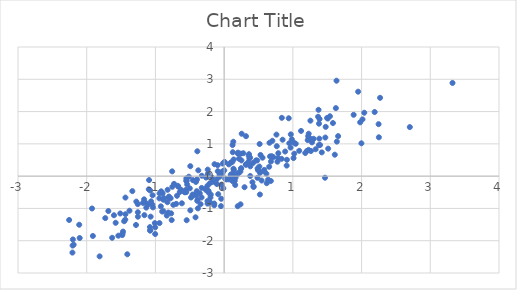
| Category | Series 0 |
|---|---|
| 0.160946651876732 | -0.274 |
| -0.615124180067025 | -0.841 |
| -0.238992660518427 | 0.202 |
| 0.614980688566654 | 0.075 |
| -0.901399740475513 | -1.096 |
| 0.348077717998722 | 0.426 |
| 0.947959158309703 | 1.018 |
| -1.72987447164957 | -1.3 |
| 0.0971250760577167 | 0.05 |
| 1.37857743076593 | 0.961 |
| -0.916733728524122 | -0.47 |
| -1.035666336437 | -0.968 |
| -0.224145165452657 | -0.513 |
| 2.70219252104673 | 1.52 |
| 0.520233681443548 | -0.569 |
| -0.459716828268949 | -0.57 |
| 0.765993572091399 | 0.927 |
| -0.802699944823501 | -0.633 |
| -0.262195468911025 | -0.371 |
| 1.58348036764361 | 1.645 |
| 1.65870819725486 | 1.239 |
| -0.390094702698103 | 0.77 |
| -1.07746904537421 | -1.686 |
| -0.242535334187792 | -0.772 |
| -1.57870613654062 | -1.445 |
| -0.894718571122171 | -0.531 |
| 0.516387038247074 | 0.995 |
| -1.62979103842948 | -1.91 |
| 0.296839254848134 | -0.343 |
| 0.278366491918356 | 0.71 |
| -1.13284176934728 | -0.975 |
| -0.324500552176947 | 0.012 |
| -1.33606163125554 | -0.464 |
| 0.380607522894947 | 0.303 |
| 2.0134998490355 | 1.759 |
| -1.43600033947788 | -1.179 |
| 1.04205325234069 | 1.003 |
| 0.244543674262494 | 0.227 |
| 1.38559620247189 | 1.161 |
| 0.248287439296835 | 0.247 |
| 0.133289291835339 | 1.064 |
| -2.25582289472346 | -1.358 |
| -0.398868811937196 | -0.466 |
| 0.199769403632539 | 0.698 |
| 1.22291797992834 | 1.235 |
| -0.342927631277945 | -0.869 |
| -0.143765697169237 | -0.849 |
| 0.412032153731006 | -0.189 |
| 1.2289241542928 | 0.813 |
| 1.42092287875088 | 0.737 |
| -0.0943369723016265 | 0.338 |
| 0.154736995946148 | -0.14 |
| -0.729374576435108 | -0.239 |
| -0.685610712656531 | -0.609 |
| -1.40929884094785 | -2.42 |
| -0.939915624690563 | -0.534 |
| -1.60339226401106 | -1.211 |
| 0.00958780984204322 | 0.435 |
| -0.410777708551837 | -0.18 |
| 0.12003371847159 | 0.444 |
| 0.31656943258921 | 0.356 |
| -0.739846252762422 | -0.888 |
| 1.3736298282967 | 2.054 |
| 1.26277412193541 | 0.779 |
| 0.659726460285925 | 1.033 |
| -0.193893966526571 | -0.571 |
| -0.554283939642186 | -0.421 |
| -1.25595506815388 | -1.118 |
| -0.884081299107951 | -0.73 |
| -1.16478087259423 | -0.719 |
| -1.0696558947721 | -1.255 |
| 0.575700237428579 | 0.159 |
| 2.24777841377026 | 1.61 |
| 0.238687291933 | -0.873 |
| 0.761270682578169 | 1.286 |
| -0.35464424898648 | -0.531 |
| -2.2077409492235 | -2.368 |
| -0.037189918367408 | -0.262 |
| 0.0328181724199283 | -0.103 |
| -1.18071868225266 | -0.828 |
| 0.176503539493442 | 0.029 |
| 1.47801327160652 | 1.527 |
| -0.226956332484346 | -0.458 |
| -0.881372321196067 | -0.713 |
| 0.521825087151675 | 0.102 |
| 0.480749457099265 | 0.487 |
| -0.576551001997264 | -0.497 |
| 0.165373655010413 | -0.049 |
| 0.0961730276308223 | 0.003 |
| -1.0795466274732 | -1.578 |
| -1.04372701538641 | -0.884 |
| -0.552592535449565 | -0.496 |
| -0.144643103648489 | -0.902 |
| 0.255553105737754 | 1.313 |
| -0.645754552755135 | -0.493 |
| 0.366965786381292 | 0.542 |
| -1.45540269402899 | -1.396 |
| 0.36171378940403 | 0.68 |
| 0.584738888834613 | 0.193 |
| 1.2303702555631 | 1.313 |
| 0.13612221278788 | 0.23 |
| -0.75641933311179 | 0.148 |
| 0.201461556067091 | 0.728 |
| 1.2350449519675 | 1.165 |
| 0.122176622145269 | 0.079 |
| 2.26921479009631 | 2.426 |
| 1.36709151016331 | 1.839 |
| -1.09699595095752 | -0.408 |
| -2.10922785658634 | -1.505 |
| -0.492223106867984 | -1.058 |
| 1.6258528814413 | 2.107 |
| 1.21625775715046 | 1.117 |
| -0.236066546333457 | 0.075 |
| -0.167677831941503 | -0.179 |
| 0.140998784969456 | 0.191 |
| -1.43650247367118 | -0.664 |
| -0.0590232346457145 | 0.038 |
| 0.64011578054153 | -0.109 |
| 0.00128070794671652 | 0.18 |
| 0.619913414094182 | -0.218 |
| 0.110262010027443 | -0.113 |
| -1.92261768418304 | -1.002 |
| -0.024052773794113 | 0.144 |
| -0.386362633615433 | -0.732 |
| -0.69812768671063 | -0.859 |
| 0.00202187886730832 | 0.434 |
| -0.205936368594316 | -0.806 |
| -1.0762481700825 | -0.443 |
| -0.77108477696187 | -1.153 |
| 1.33181821435059 | 0.834 |
| -1.3773593544243 | -1.071 |
| -1.00842096559924 | -1.454 |
| -0.921229870327564 | -0.936 |
| 0.236247621529173 | 0.142 |
| 1.88459375859967 | 1.9 |
| 2.19072418627481 | 1.986 |
| 1.3024521514489 | 1.157 |
| -2.20157151487506 | -1.961 |
| 1.01436566004417 | 1.037 |
| 0.0678569007901561 | 0.364 |
| -1.00365372459943 | -1.792 |
| 1.63546048211918 | 2.956 |
| -0.550327791081784 | -0.148 |
| -0.390768462835063 | -0.767 |
| -0.395259857391023 | -0.104 |
| -0.492406833780947 | 0.308 |
| -0.263170050333482 | -0.044 |
| 0.378366619189462 | 0.574 |
| 0.54558768172162 | -0.136 |
| -0.0424101694434541 | -0.702 |
| -1.0750092090895 | -1.68 |
| 0.124514748254044 | -0.159 |
| -0.375935062910946 | 0.18 |
| -0.565899622209159 | -0.496 |
| -0.825763906440871 | -0.807 |
| -1.16081348131615 | -1.209 |
| -0.109728575653995 | -0.101 |
| -0.0455316197579109 | -0.929 |
| 0.910025577600881 | 0.327 |
| 1.38893253292281 | 1.769 |
| 1.0101751389894 | 0.56 |
| -0.545302776391033 | -1.365 |
| -0.450405230399172 | -0.601 |
| 0.242665773001131 | 0.697 |
| 1.2779776062032 | 1.046 |
| -1.04154395099007 | -0.592 |
| -1.0626679138137 | -0.78 |
| -0.0860539900831163 | -0.558 |
| -1.68508825794761 | -1.08 |
| 1.38015558291626 | 1.625 |
| 0.693585618785266 | 0.617 |
| 0.0698282360754584 | -0.101 |
| -0.88428149226856 | -1.084 |
| -1.00349428980333 | -1.586 |
| 1.18042031157257 | 0.717 |
| 0.702056181231306 | 1.095 |
| 0.970159951329162 | 1.294 |
| -0.328233349768707 | -0.66 |
| -0.546224963680282 | -0.151 |
| -0.674321752569604 | -0.299 |
| 2.03940004097518 | 1.964 |
| -0.0923888042261494 | 0.153 |
| 0.379372548008352 | 0.003 |
| 0.42054064236529 | 0.409 |
| -0.813005153942068 | -1.127 |
| -0.822989326925402 | -0.423 |
| 0.775944859024639 | 0.448 |
| 0.788241458064685 | 0.711 |
| 1.20473229722529 | 0.781 |
| -0.0236723286031344 | 0.087 |
| 0.429523897796119 | -0.335 |
| 0.463733253037703 | 0.487 |
| 0.888151323778845 | 0.763 |
| -1.47861732795065 | -1.777 |
| -0.500011720506139 | -0.378 |
| -0.416460606544414 | -1.275 |
| 0.55854076793319 | 0.571 |
| -0.0657614272614474 | 0.043 |
| 1.5138828670756 | 0.852 |
| 0.66754260112605 | 0.612 |
| -1.43892465839805 | -1.349 |
| -0.51290087609768 | -0.018 |
| 1.97966356263047 | 1.666 |
| -1.48309015848548 | -1.826 |
| -0.019887579662568 | 0.389 |
| 1.2555482917587 | 1.718 |
| 0.680843910542844 | 0.454 |
| -0.326343721841577 | -0.364 |
| 0.197698675892169 | -0.931 |
| -0.264216122106881 | -0.429 |
| 0.486586738728479 | 0.239 |
| 1.94997847738214 | 2.616 |
| 0.139028796722356 | 0.516 |
| -0.0317218298179695 | 0.097 |
| -0.482221897910345 | -0.662 |
| -0.241093974616651 | -0.851 |
| 0.207953673906911 | 0.086 |
| -1.28273411839393 | -1.513 |
| 0.125771678213468 | 0.741 |
| 1.46788754006885 | -0.049 |
| 3.32343380635767 | 2.887 |
| 0.426327517144408 | -0.316 |
| -0.0339004019946538 | 0.119 |
| -0.0678033009383072 | -0.021 |
| 1.39525643035082 | 0.965 |
| -0.666544754048096 | -0.326 |
| -0.403732817304221 | -0.593 |
| 0.966590798569188 | 0.884 |
| -2.20514255359296 | -2.15 |
| 0.484861432099603 | -0.053 |
| -0.763456804936866 | -1.361 |
| -0.381861767540705 | -0.998 |
| -0.83482516298054 | -1.221 |
| -2.18994161618382 | -2.122 |
| -1.51172002682511 | -1.157 |
| -0.754175929338002 | -0.33 |
| 0.318139938455239 | 0.356 |
| -0.105247894469921 | -0.244 |
| 0.98484274173271 | 1.141 |
| -1.25473167513168 | -1.256 |
| -1.1345868180428 | -0.841 |
| 0.850667287558489 | 1.128 |
| 1.61044612653865 | 0.664 |
| 0.25210804593591 | 0.487 |
| 0.835894666147173 | 0.537 |
| 0.357937355647725 | 0.632 |
| 0.122584566144871 | 0.964 |
| 1.09202887720885 | 0.784 |
| 1.47248109070115 | 1.196 |
| 1.99775325983894 | 1.017 |
| -0.538261719624117 | -0.258 |
| 0.529077525481578 | 0.656 |
| -0.199194769550409 | -0.663 |
| 0.655356984430444 | 0.291 |
| -0.207936896883428 | -0.22 |
| -0.940973271419177 | -1.454 |
| 1.02027044221596 | 0.694 |
| -0.803480649208657 | -0.671 |
| 0.91369874199455 | 0.507 |
| 1.64000634739927 | 1.07 |
| 0.0985160587595522 | 0.423 |
| -0.410758595790261 | -0.558 |
| 0.200581486312416 | 0.086 |
| -0.626210963654759 | -0.427 |
| 1.26054726828803 | 1.154 |
| 1.53971655516129 | 1.855 |
| 0.49390800073465 | 0.207 |
| -1.47165023821116 | -1.717 |
| 0.782961502888384 | 0.564 |
| 2.25179867651005 | 1.204 |
| -1.91011920966467 | -1.853 |
| -0.942837836996195 | -0.688 |
| 0.163225356632326 | 0 |
| -1.53997235436216 | -1.845 |
| 0.939710285118875 | 1.793 |
| 0.714115682199137 | 0.59 |
| 1.11935938199218 | 1.4 |
| -1.81219758921645 | -2.484 |
| -0.778476273618659 | -0.686 |
| 1.50741773374501 | 1.784 |
| 0.2166167955714 | 0.539 |
| 0.318288197268549 | 1.237 |
| 0.679416957951939 | -0.149 |
| -1.27789218373092 | -0.789 |
| -1.09252514449825 | -0.121 |
| -1.11055880117744 | -0.884 |
| 0.0146863698437351 | -0.077 |
| -0.0119868387715316 | -0.375 |
| 1.49859953606058 | 1.802 |
| 0.512708793770507 | 0.297 |
| -1.25662266978372 | -0.866 |
| -0.176623119742162 | -0.043 |
| -0.139811636845756 | 0.369 |
| -0.453674707860817 | -0.125 |
| -2.10246643953756 | -1.916 |
| 0.495029409181156 | 0.182 |
| -0.877972482477954 | -0.678 |
| 0.839610825434974 | 1.806 |
| -0.241491200506211 | -0.295 |
| -0.550442895603169 | -0.073 |